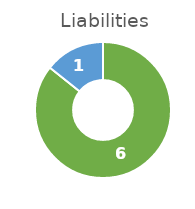
| Category | Amount |
|---|---|
| Met | 6 |
| Missed | 1 |